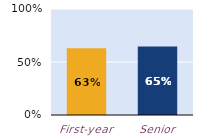
| Category | substantially |
|---|---|
| First-year | 0.629 |
| Senior | 0.647 |